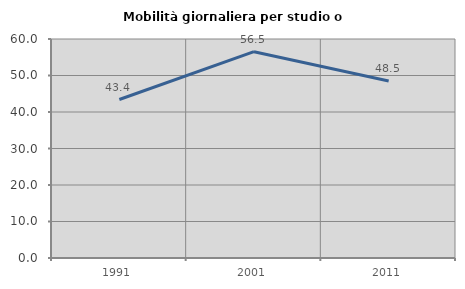
| Category | Mobilità giornaliera per studio o lavoro |
|---|---|
| 1991.0 | 43.415 |
| 2001.0 | 56.522 |
| 2011.0 | 48.496 |